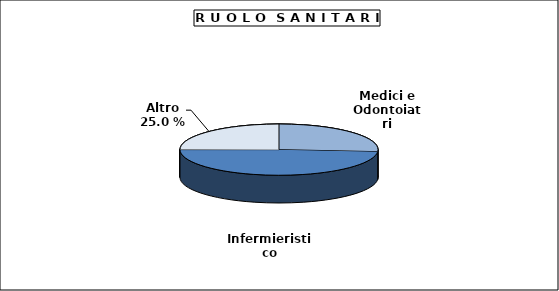
| Category | Personale altri ruoli |
|---|---|
| Medici e Odontoiatri | 4290 |
| Infermieristico | 7963 |
| Altro | 4081 |